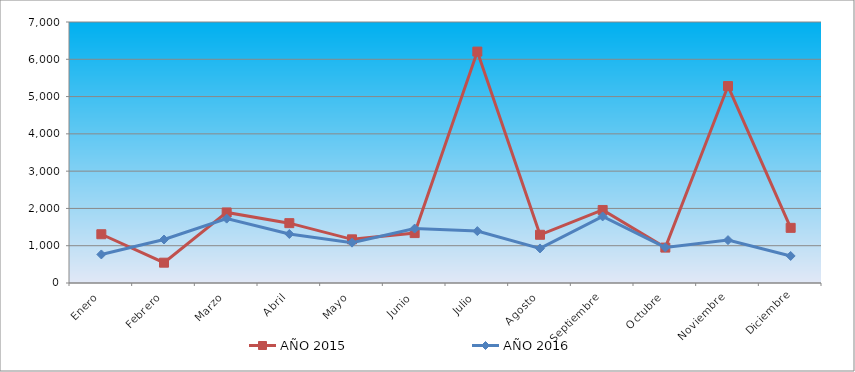
| Category | AÑO 2015 | AÑO 2016 |
|---|---|---|
| Enero | 1307.699 | 765.866 |
| Febrero | 545.154 | 1166.193 |
| Marzo | 1892.161 | 1726.512 |
| Abril | 1605.085 | 1314.257 |
| Mayo | 1170.923 | 1081.782 |
| Junio | 1338.765 | 1459.941 |
| Julio | 6206.364 | 1391.749 |
| Agosto | 1293.333 | 926.799 |
| Septiembre | 1958.404 | 1785.406 |
| Octubre | 949.199 | 954.696 |
| Noviembre | 5281.514 | 1149.975 |
| Diciembre | 1478.972 | 725.321 |